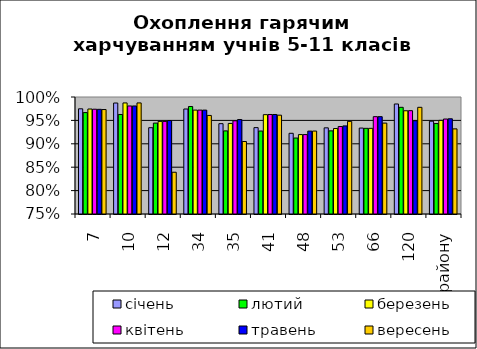
| Category | січень | лютий | березень | квітень | травень | вересень |
|---|---|---|---|---|---|---|
| 7 | 0.975 | 0.967 | 0.974 | 0.974 | 0.974 | 0.973 |
| 10 | 0.987 | 0.963 | 0.987 | 0.981 | 0.981 | 0.987 |
| 12 | 0.934 | 0.944 | 0.948 | 0.948 | 0.95 | 0.839 |
| 34 | 0.974 | 0.98 | 0.972 | 0.972 | 0.972 | 0.961 |
| 35 | 0.943 | 0.928 | 0.944 | 0.949 | 0.952 | 0.905 |
| 41 | 0.935 | 0.927 | 0.962 | 0.963 | 0.963 | 0.961 |
| 48 | 0.922 | 0.912 | 0.92 | 0.92 | 0.927 | 0.927 |
| 53 | 0.934 | 0.928 | 0.933 | 0.937 | 0.938 | 0.948 |
| 66 | 0.934 | 0.933 | 0.933 | 0.958 | 0.958 | 0.944 |
| 120 | 0.985 | 0.978 | 0.971 | 0.971 | 0.949 | 0.978 |
| по району | 0.948 | 0.943 | 0.95 | 0.953 | 0.953 | 0.932 |